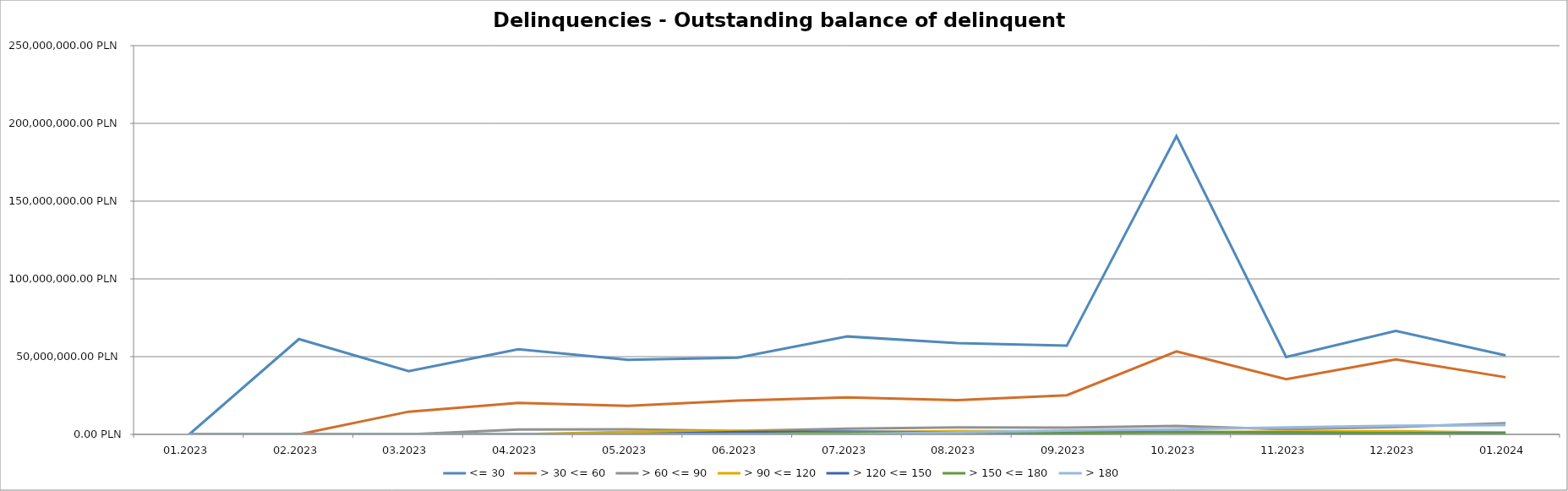
| Category | <= 30 | > 30 <= 60 | > 60 <= 90 | > 90 <= 120 | > 120 <= 150 | > 150 <= 180 | > 180 |
|---|---|---|---|---|---|---|---|
| 01.2023 | 0 | 0 | 0 | 0 | 0 | 0 | 0 |
| 02.2023 | 61279332.52 | 0 | 0 | 0 | 0 | 0 | 0 |
| 03.2023 | 40663789.15 | 14592814.21 | 0 | 0 | 0 | 0 | 0 |
| 04.2023 | 54729258.98 | 20207986.71 | 3105470.81 | 0 | 0 | 0 | 0 |
| 05.2023 | 47980491.52 | 18365026.23 | 3236930.39 | 1575049.71 | 0 | 0 | 0 |
| 06.2023 | 49274463.43 | 21757116.33 | 2145346.9 | 2234258.08 | 1546159.58 | 0 | 0 |
| 07.2023 | 62971390.96 | 23765504.45 | 3638339.96 | 1315739.52 | 1741228.92 | 1367122.32 | 0 |
| 08.2023 | 58667444.31 | 21958530.42 | 4534282.61 | 1998402.31 | 1197894.69 | 1186456.03 | 1367122.32 |
| 09.2023 | 57013090.09 | 25164417.49 | 4339269.75 | 1883194.82 | 1723494.5 | 705526.9 | 2508053.04 |
| 10.2023 | 191776280.48 | 53378945.55 | 5393392.38 | 1354505.77 | 1667300.89 | 1446484.43 | 3213579.94 |
| 11.2023 | 49723312.18 | 35482092.6 | 3276474.02 | 1813628.1 | 960023.75 | 1340003.09 | 4479480.65 |
| 12.2023 | 66557683.94 | 48283270.27 | 4762291.3 | 2048088.54 | 703260.31 | 730995.54 | 5619137.42 |
| 01.2024 | 50804141.07 | 36744266.23 | 7177545.74 | 1129913.48 | 940419.11 | 657491.3 | 5911358.03 |